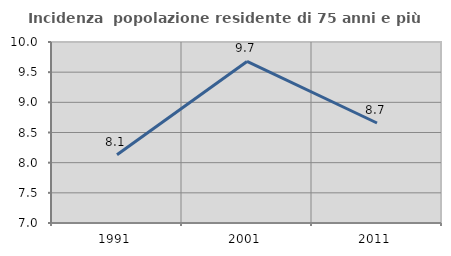
| Category | Incidenza  popolazione residente di 75 anni e più |
|---|---|
| 1991.0 | 8.13 |
| 2001.0 | 9.677 |
| 2011.0 | 8.657 |